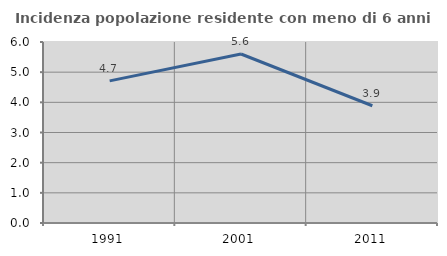
| Category | Incidenza popolazione residente con meno di 6 anni |
|---|---|
| 1991.0 | 4.712 |
| 2001.0 | 5.603 |
| 2011.0 | 3.886 |